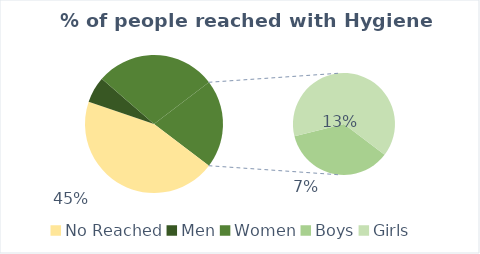
| Category | Series 0 |
|---|---|
| No Reached | 53458 |
| Men | 7303 |
| Women | 33732 |
| Boys | 8819 |
| Girls | 15808 |